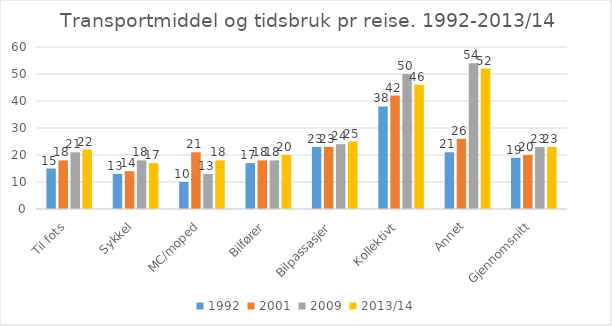
| Category | 1992 | 2001 | 2009 | 2013/14 |
|---|---|---|---|---|
| Til fots | 15 | 18 | 21 | 22 |
| Sykkel | 13 | 14 | 18 | 17 |
| MC/moped | 10 | 21 | 13 | 18 |
| Bilfører | 17 | 18 | 18 | 20 |
| Bilpassasjer | 23 | 23 | 24 | 25 |
| Kollektivt | 38 | 42 | 50 | 46 |
| Annet | 21 | 26 | 54 | 52 |
| Gjennomsnitt | 19 | 20 | 23 | 23 |